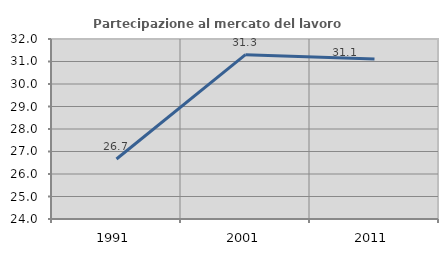
| Category | Partecipazione al mercato del lavoro  femminile |
|---|---|
| 1991.0 | 26.667 |
| 2001.0 | 31.304 |
| 2011.0 | 31.111 |